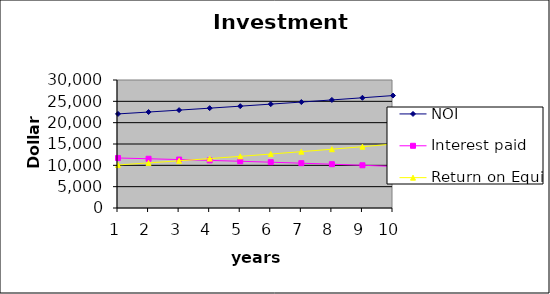
| Category | NOI | Interest paid | Return on Equity |
|---|---|---|---|
| 0 | 22050.77 | 11720.926 | 10086.878 |
| 1 | 22491.785 | 11542.787 | 10569.818 |
| 2 | 22941.621 | 11355.535 | 11066.747 |
| 3 | 23400.454 | 11158.702 | 11578.166 |
| 4 | 23868.463 | 10951.799 | 12104.598 |
| 5 | 24345.832 | 10734.31 | 12646.587 |
| 6 | 24832.748 | 10505.694 | 13204.702 |
| 7 | 25329.403 | 10265.382 | 13779.537 |
| 8 | 25835.992 | 10012.775 | 14371.709 |
| 9 | 26352.711 | 9747.244 | 14981.864 |